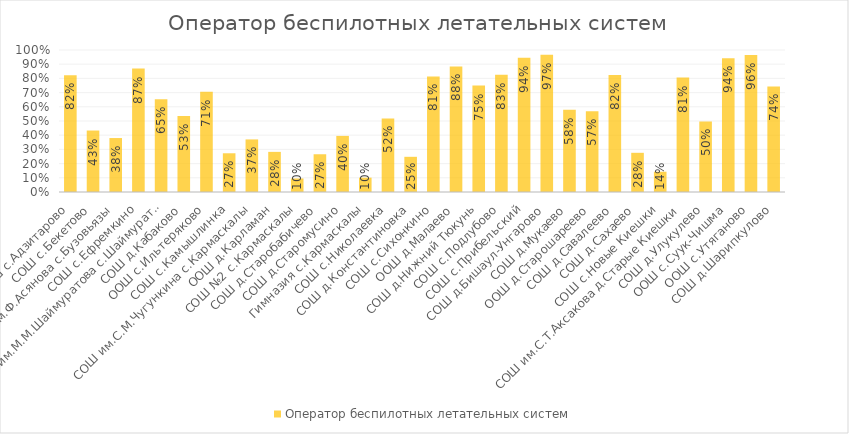
| Category | Оператор беспилотных летательных систем |
|---|---|
| СОШ с.Адзитарово | 0.821 |
| СОШ с.Бекетово | 0.433 |
| СОШ им.Ф.Асянова с.Бузовьязы | 0.38 |
| СОШ с.Ефремкино | 0.87 |
| СОШ им.М.М.Шаймуратова с.Шаймуратово | 0.653 |
| СОШ д.Кабаково | 0.535 |
| ООШ с.Ильтеряково | 0.705 |
| СОШ с.Камышлинка | 0.273 |
| СОШ им.С.М.Чугункина с.Кармаскалы | 0.37 |
| ООШ д.Карламан | 0.283 |
| СОШ №2 с.Кармаскалы | 0.095 |
| СОШ д.Старобабичево | 0.266 |
| СОШ д.Старомусино | 0.395 |
| Гимназия с.Кармаскалы | 0.101 |
| СОШ с.Николаевка | 0.518 |
| СОШ д.Константиновка | 0.248 |
| СОШ с.Сихонкино | 0.814 |
| ООШ д.Малаево | 0.885 |
| СОШ д.Нижний Тюкунь | 0.75 |
| СОШ с.Подлубово | 0.826 |
| СОШ с.Прибельский | 0.945 |
| СОШ д.Бишаул-Унгарово | 0.967 |
| СОШ д.Мукаево | 0.579 |
| ООШ д.Старошареево | 0.568 |
| СОШ д.Савалеево | 0.825 |
| СОШ д.Сахаево | 0.276 |
| СОШ с.Новые Киешки | 0.143 |
| СОШ им.С.Т.Аксакова д.Старые Киешки | 0.806 |
| СОШ д.Улукулево | 0.497 |
| ООШ с.Суук-Чишма | 0.941 |
| ООШ с.Утяганово | 0.964 |
| СОШ д.Шарипкулово | 0.744 |